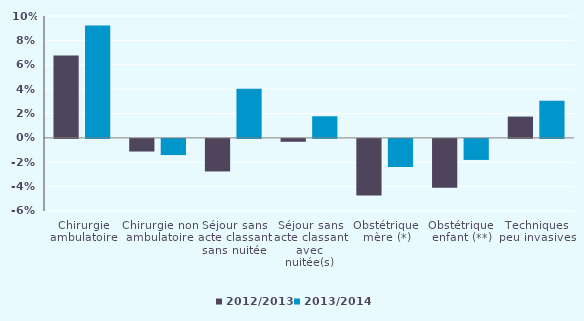
| Category | 2012/2013 | 2013/2014 |
|---|---|---|
| Chirurgie
ambulatoire | 0.068 | 0.092 |
| Chirurgie non
ambulatoire | -0.01 | -0.013 |
| Séjour sans
acte classant
sans nuitée | -0.027 | 0.04 |
| Séjour sans
acte classant
avec nuitée(s) | -0.002 | 0.018 |
| Obstétrique
mère (*) | -0.046 | -0.023 |
| Obstétrique
enfant (**) | -0.04 | -0.017 |
| Techniques
peu invasives | 0.017 | 0.03 |